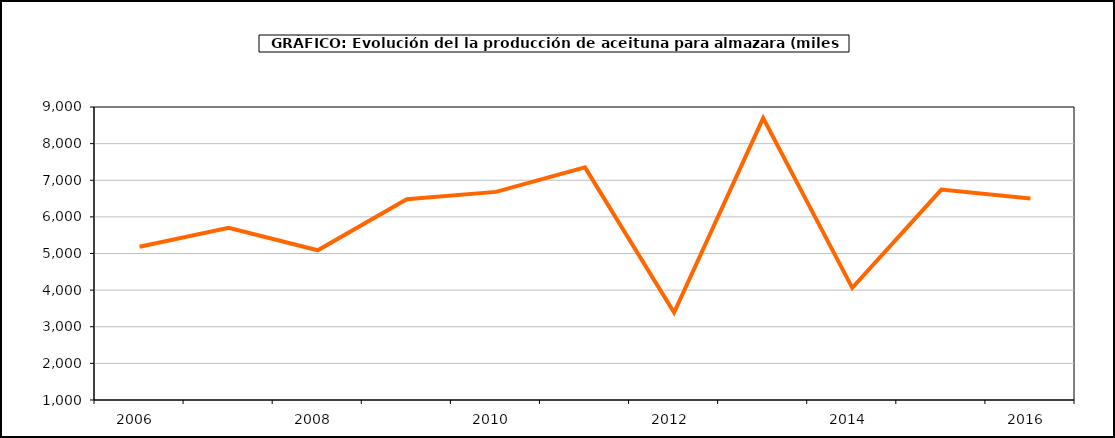
| Category | producción |
|---|---|
| 2006.0 | 5183.035 |
| 2007.0 | 5701.679 |
| 2008.0 | 5088.942 |
| 2009.0 | 6482.726 |
| 2010.0 | 6682.009 |
| 2011.0 | 7352.697 |
| 2012.0 | 3387.3 |
| 2013.0 | 8695.861 |
| 2014.0 | 4060.978 |
| 2015.0 | 6745.306 |
| 2016.0 | 6499.902 |